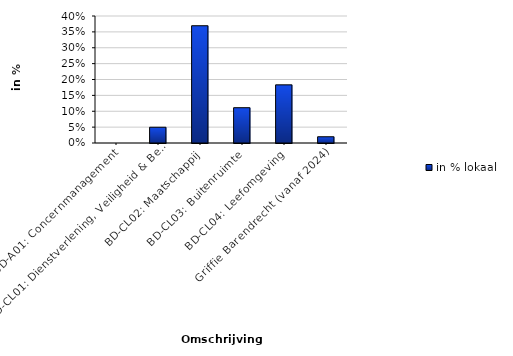
| Category | in % lokaal |
|---|---|
| BD-A01: Concernmanagement | 0 |
| BD-CL01: Dienstverlening, Veiligheid & Bestuur | 0.05 |
| BD-CL02: Maatschappij | 0.369 |
| BD-CL03: Buitenruimte | 0.111 |
| BD-CL04: Leefomgeving | 0.183 |
| Griffie Barendrecht (vanaf 2024) | 0.02 |